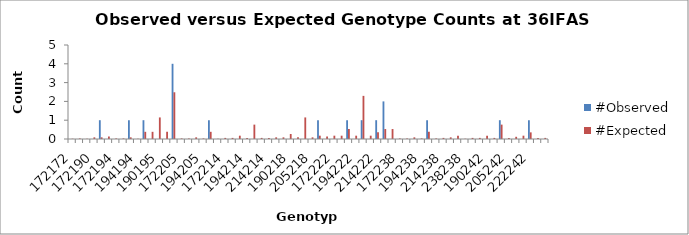
| Category | #Observed | #Expected |
|---|---|---|
| 172172.0 | 0 | 0.015 |
| 172186.0 | 0 | 0.029 |
| 186186.0 | 0 | 0.015 |
| 172190.0 | 0 | 0.088 |
| 186190.0 | 1 | 0.088 |
| 190190.0 | 0 | 0.132 |
| 172194.0 | 0 | 0.029 |
| 186194.0 | 0 | 0.029 |
| 190194.0 | 1 | 0.088 |
| 194194.0 | 0 | 0.015 |
| 172195.0 | 1 | 0.382 |
| 186195.0 | 0 | 0.382 |
| 190195.0 | 0 | 1.147 |
| 194195.0 | 0 | 0.382 |
| 195195.0 | 4 | 2.485 |
| 172205.0 | 0 | 0.029 |
| 186205.0 | 0 | 0.029 |
| 190205.0 | 0 | 0.088 |
| 194205.0 | 0 | 0.029 |
| 195205.0 | 1 | 0.382 |
| 205205.0 | 0 | 0.015 |
| 172214.0 | 0 | 0.059 |
| 186214.0 | 0 | 0.059 |
| 190214.0 | 0 | 0.176 |
| 194214.0 | 0 | 0.059 |
| 195214.0 | 0 | 0.765 |
| 205214.0 | 0 | 0.059 |
| 214214.0 | 0 | 0.059 |
| 172218.0 | 0 | 0.088 |
| 186218.0 | 0 | 0.088 |
| 190218.0 | 0 | 0.265 |
| 194218.0 | 0 | 0.088 |
| 195218.0 | 0 | 1.147 |
| 205218.0 | 0 | 0.088 |
| 214218.0 | 1 | 0.176 |
| 218218.0 | 0 | 0.132 |
| 172222.0 | 0 | 0.176 |
| 186222.0 | 0 | 0.176 |
| 190222.0 | 1 | 0.529 |
| 194222.0 | 0 | 0.176 |
| 195222.0 | 1 | 2.294 |
| 205222.0 | 0 | 0.176 |
| 214222.0 | 1 | 0.353 |
| 218222.0 | 2 | 0.529 |
| 222222.0 | 0 | 0.529 |
| 172238.0 | 0 | 0.029 |
| 186238.0 | 0 | 0.029 |
| 190238.0 | 0 | 0.088 |
| 194238.0 | 0 | 0.029 |
| 195238.0 | 1 | 0.382 |
| 205238.0 | 0 | 0.029 |
| 214238.0 | 0 | 0.059 |
| 218238.0 | 0 | 0.088 |
| 222238.0 | 0 | 0.176 |
| 238238.0 | 0 | 0.015 |
| 172242.0 | 0 | 0.059 |
| 186242.0 | 0 | 0.059 |
| 190242.0 | 0 | 0.176 |
| 194242.0 | 0 | 0.059 |
| 195242.0 | 1 | 0.765 |
| 205242.0 | 0 | 0.059 |
| 214242.0 | 0 | 0.118 |
| 218242.0 | 0 | 0.176 |
| 222242.0 | 1 | 0.353 |
| 238242.0 | 0 | 0.059 |
| 242242.0 | 0 | 0.059 |